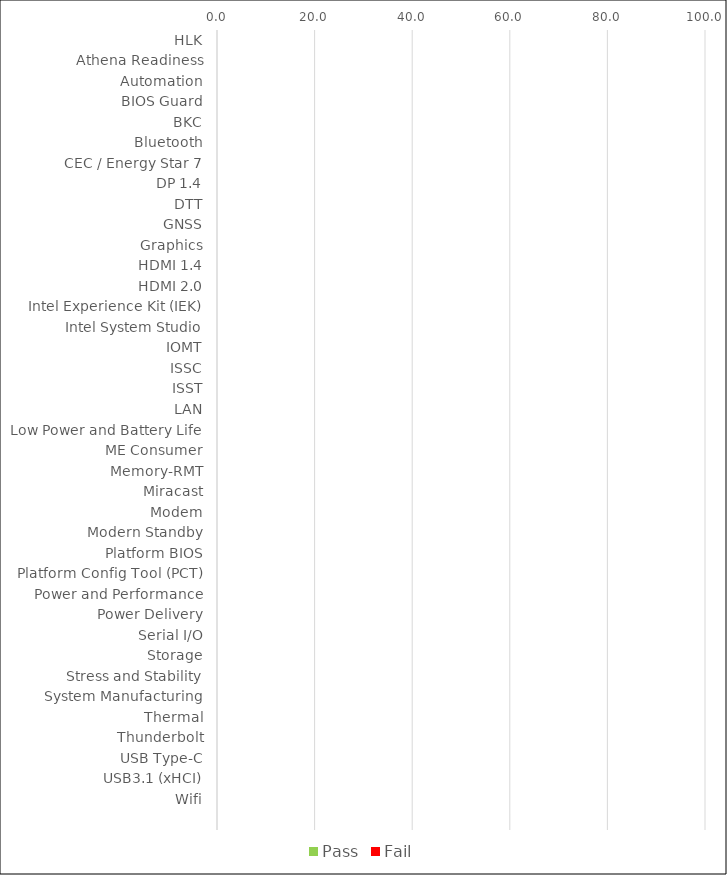
| Category | Pass | Fail |
|---|---|---|
| HLK | 0 | 0 |
| Athena Readiness | 0 | 0 |
| Automation | 0 | 0 |
| BIOS Guard | 0 | 0 |
| BKC | 0 | 0 |
| Bluetooth | 0 | 0 |
| CEC / Energy Star 7 | 0 | 0 |
| DP 1.4 | 0 | 0 |
| DTT | 0 | 0 |
| GNSS | 0 | 0 |
| Graphics | 0 | 0 |
| HDMI 1.4 | 0 | 0 |
| HDMI 2.0 | 0 | 0 |
| Intel Experience Kit (IEK) | 0 | 0 |
| Intel System Studio | 0 | 0 |
| IOMT | 0 | 0 |
| ISSC | 0 | 0 |
| ISST | 0 | 0 |
| LAN | 0 | 0 |
| Low Power and Battery Life | 0 | 0 |
| ME Consumer | 0 | 0 |
| Memory-RMT | 0 | 0 |
| Miracast | 0 | 0 |
| Modem | 0 | 0 |
| Modern Standby | 0 | 0 |
| Platform BIOS | 0 | 0 |
| Platform Config Tool (PCT) | 0 | 0 |
| Power and Performance | 0 | 0 |
| Power Delivery | 0 | 0 |
| Serial I/O | 0 | 0 |
| Storage | 0 | 0 |
| Stress and Stability | 0 | 0 |
| System Manufacturing | 0 | 0 |
| Thermal | 0 | 0 |
| Thunderbolt | 0 | 0 |
| USB Type-C | 0 | 0 |
| USB3.1 (xHCI) | 0 | 0 |
| Wifi | 0 | 0 |